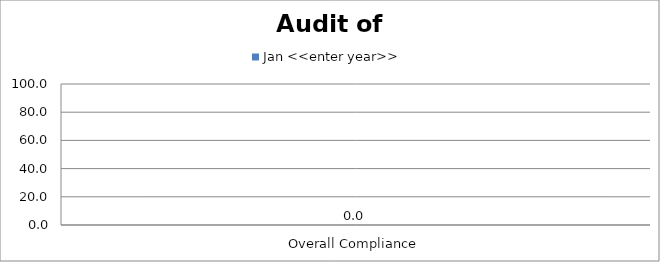
| Category | Jan <<enter year>> |
|---|---|
| Overall Compliance | 0 |